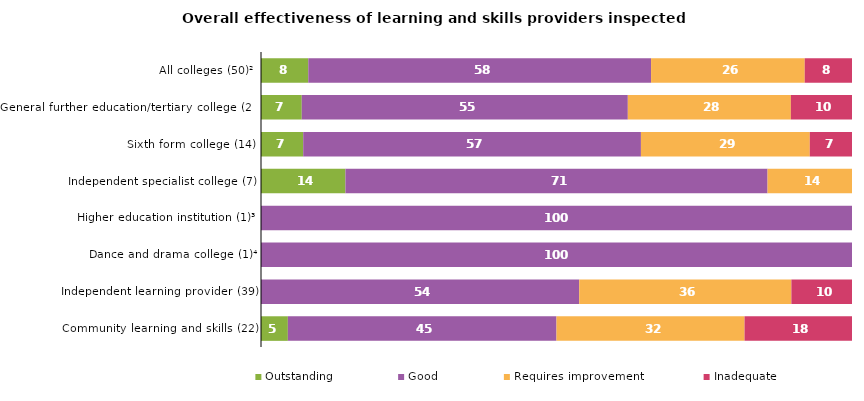
| Category | Outstanding | Good | Requires improvement | Inadequate |
|---|---|---|---|---|
| All colleges (50)² | 8 | 58 | 26 | 8 |
| General further education/tertiary college (29) | 6.897 | 55.172 | 27.586 | 10.345 |
| Sixth form college (14) | 7.143 | 57.143 | 28.571 | 7.143 |
| Independent specialist college (7) | 14.286 | 71.429 | 14.286 | 0 |
| Higher education institution (1)³ | 0 | 100 | 0 | 0 |
| Dance and drama college (1)⁴ | 0 | 100 | 0 | 0 |
| Independent learning provider (39) | 0 | 53.846 | 35.897 | 10.256 |
| Community learning and skills (22) | 4.545 | 45.455 | 31.818 | 18.182 |